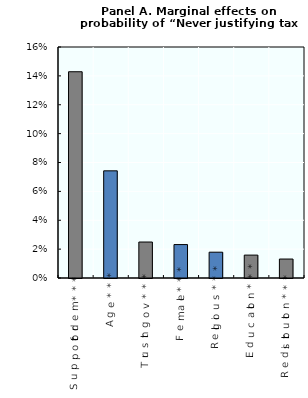
| Category | Series 0 |
|---|---|
| Support for dem*** | 0.143 |
| Age*** | 0.074 |
| Trust in gov*** | 0.025 |
| Female*** | 0.023 |
| Religious*** | 0.018 |
| Education*** | 0.016 |
| Redistribution*** | 0.013 |